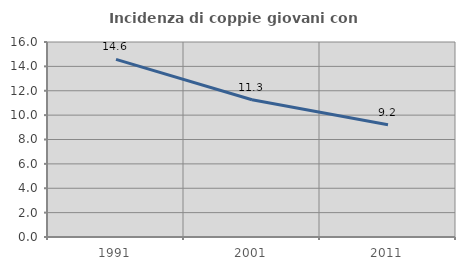
| Category | Incidenza di coppie giovani con figli |
|---|---|
| 1991.0 | 14.57 |
| 2001.0 | 11.258 |
| 2011.0 | 9.211 |